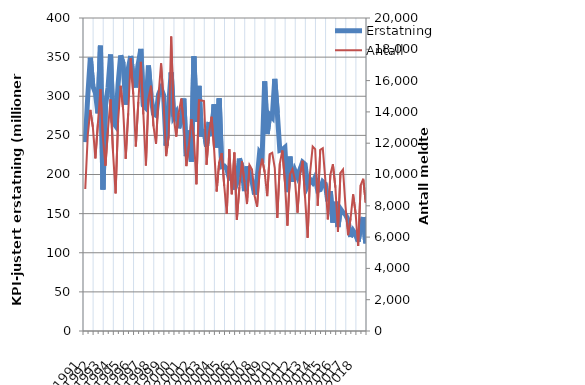
| Category | Erstatning |
|---|---|
| 1991.0 | 241.512 |
| nan | 300.484 |
| nan | 349.229 |
| nan | 312.784 |
| 1992.0 | 304.478 |
| nan | 278.208 |
| nan | 364.59 |
| nan | 180.822 |
| 1993.0 | 288.461 |
| nan | 310.805 |
| nan | 353.36 |
| nan | 266.815 |
| 1994.0 | 262.274 |
| nan | 315.803 |
| nan | 352.253 |
| nan | 341.743 |
| 1995.0 | 289.353 |
| nan | 334.727 |
| nan | 351.511 |
| nan | 321.88 |
| 1996.0 | 311.182 |
| nan | 341.606 |
| nan | 360.422 |
| nan | 288.15 |
| 1997.0 | 284.885 |
| nan | 339.314 |
| nan | 300.337 |
| nan | 277.65 |
| 1998.0 | 275.579 |
| nan | 302.306 |
| nan | 309.99 |
| nan | 301.649 |
| 1999.0 | 236.975 |
| nan | 287.546 |
| nan | 330.467 |
| nan | 274.094 |
| 2000.0 | 279.396 |
| nan | 259.108 |
| nan | 271.791 |
| nan | 297.135 |
| 2001.0 | 223.442 |
| nan | 256.28 |
| nan | 216.416 |
| nan | 351.008 |
| 2002.0 | 267.246 |
| nan | 313.315 |
| nan | 248.469 |
| nan | 257.968 |
| 2003.0 | 235.696 |
| nan | 267.073 |
| nan | 249.034 |
| nan | 289.563 |
| 2004.0 | 234.508 |
| nan | 297.283 |
| nan | 210.036 |
| nan | 210.913 |
| 2005.0 | 207.315 |
| nan | 195.391 |
| nan | 196.202 |
| nan | 180.683 |
| 2006.0 | 190.639 |
| nan | 220.461 |
| nan | 210.264 |
| nan | 178.732 |
| 2007.0 | 210.283 |
| nan | 200.876 |
| nan | 191.579 |
| nan | 174.481 |
| 2008.0 | 193.854 |
| nan | 227.933 |
| nan | 223.378 |
| nan | 319.11 |
| 2009.0 | 251.747 |
| nan | 276.295 |
| nan | 272.836 |
| nan | 322.248 |
| 2010.0 | 278.8 |
| nan | 230.847 |
| nan | 231.794 |
| nan | 234.558 |
| 2011.0 | 177.415 |
| nan | 222.865 |
| nan | 190.831 |
| nan | 204.834 |
| 2012.0 | 196.954 |
| nan | 206.447 |
| nan | 215.756 |
| nan | 212.921 |
| 2013.0 | 186.273 |
| nan | 193.614 |
| nan | 189.634 |
| nan | 196.473 |
| 2014.0 | 179.514 |
| nan | 180.663 |
| nan | 190.729 |
| nan | 187.76 |
| 2015.0 | 165.698 |
| nan | 178.529 |
| nan | 138.58 |
| nan | 165.16 |
| 2016.0 | 133.009 |
| nan | 156.105 |
| nan | 151.513 |
| nan | 148.772 |
| 2017.0 | 142.307 |
| nan | 120.109 |
| nan | 128.261 |
| nan | 123.332 |
| 2018.0 | 114.373 |
| nan | 132.74 |
| nan | 145.634 |
| nan | 111.98 |